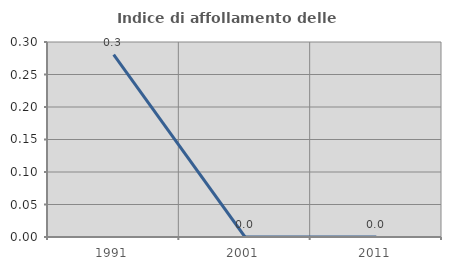
| Category | Indice di affollamento delle abitazioni  |
|---|---|
| 1991.0 | 0.281 |
| 2001.0 | 0 |
| 2011.0 | 0 |